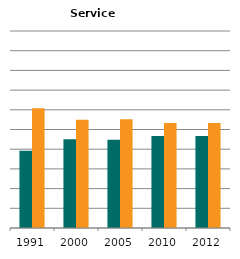
| Category | Male | Female |
|---|---|---|
| 1991.0 | 0.392 | 0.608 |
| 2000.0 | 0.45 | 0.55 |
| 2005.0 | 0.448 | 0.552 |
| 2010.0 | 0.466 | 0.534 |
| 2012.0 | 0.467 | 0.533 |